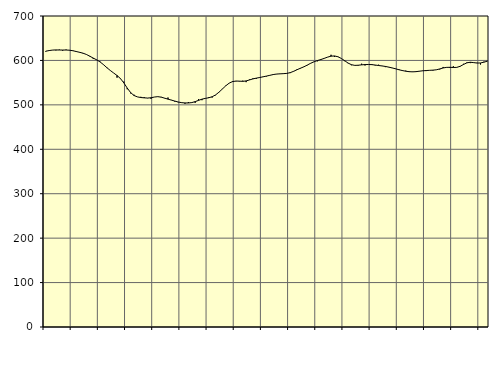
| Category | Piggar | Series 1 |
|---|---|---|
| nan | 619.7 | 620.73 |
| 87.0 | 622 | 622.19 |
| 87.0 | 623.1 | 623.29 |
| 87.0 | 622.6 | 623.64 |
| nan | 624.4 | 623.42 |
| 88.0 | 621.9 | 623.4 |
| 88.0 | 624.4 | 623.42 |
| 88.0 | 623.5 | 622.99 |
| nan | 621.2 | 621.82 |
| 89.0 | 621.1 | 620.06 |
| 89.0 | 618.9 | 618.25 |
| 89.0 | 615.7 | 616.25 |
| nan | 613.7 | 613.35 |
| 90.0 | 610.1 | 609.4 |
| 90.0 | 603.4 | 605.26 |
| 90.0 | 601.9 | 601.32 |
| nan | 597.5 | 596.67 |
| 91.0 | 590.2 | 590.57 |
| 91.0 | 582.8 | 583.75 |
| 91.0 | 577.6 | 577.49 |
| nan | 571.8 | 571.72 |
| 92.0 | 561.2 | 566.08 |
| 92.0 | 558.5 | 559.22 |
| 92.0 | 552.3 | 549.41 |
| nan | 535.1 | 537.87 |
| 93.0 | 525.8 | 527.65 |
| 93.0 | 522.8 | 521.03 |
| 93.0 | 517.8 | 517.9 |
| nan | 518.1 | 516.51 |
| 94.0 | 517.5 | 515.77 |
| 94.0 | 515 | 515.35 |
| 94.0 | 513.6 | 515.94 |
| nan | 517.7 | 517.61 |
| 95.0 | 518.2 | 518.44 |
| 95.0 | 517.9 | 517.31 |
| 95.0 | 514.7 | 515.1 |
| nan | 516.5 | 512.84 |
| 96.0 | 511.1 | 510.7 |
| 96.0 | 507.3 | 508.51 |
| 96.0 | 505.9 | 506.4 |
| nan | 505.5 | 504.96 |
| 97.0 | 502.5 | 504.31 |
| 97.0 | 506.3 | 504.22 |
| 97.0 | 505.6 | 505.11 |
| nan | 504.5 | 507.26 |
| 98.0 | 512.9 | 510.11 |
| 98.0 | 510.5 | 512.82 |
| 98.0 | 513.9 | 514.57 |
| nan | 517.4 | 515.97 |
| 99.0 | 516.4 | 518.27 |
| 99.0 | 521.7 | 522.31 |
| 99.0 | 528.7 | 528.45 |
| nan | 536.1 | 535.62 |
| 0.0 | 543.4 | 542.8 |
| 0.0 | 549 | 548.84 |
| 0.0 | 553.5 | 552.34 |
| nan | 553 | 553.6 |
| 1.0 | 552.7 | 553.36 |
| 1.0 | 554.5 | 552.91 |
| 1.0 | 551.1 | 553.88 |
| nan | 557.1 | 556.12 |
| 2.0 | 559.7 | 558.4 |
| 2.0 | 558.5 | 560.16 |
| 2.0 | 562.3 | 561.57 |
| nan | 563.5 | 563.15 |
| 3.0 | 564 | 564.79 |
| 3.0 | 566.4 | 566.49 |
| 3.0 | 569.2 | 568.23 |
| nan | 569.1 | 569.35 |
| 4.0 | 569.6 | 569.81 |
| 4.0 | 569.7 | 570.25 |
| 4.0 | 571.2 | 570.88 |
| nan | 571.5 | 572.53 |
| 5.0 | 576.1 | 575.57 |
| 5.0 | 580.2 | 579.14 |
| 5.0 | 581.8 | 582.49 |
| nan | 585.9 | 585.62 |
| 6.0 | 589 | 589.52 |
| 6.0 | 594 | 593.61 |
| 6.0 | 597.3 | 597.02 |
| nan | 598 | 599.76 |
| 7.0 | 603.1 | 602 |
| 7.0 | 605 | 604.65 |
| 7.0 | 607.3 | 607.48 |
| nan | 612.7 | 609.6 |
| 8.0 | 607.9 | 610.1 |
| 8.0 | 609 | 608.33 |
| 8.0 | 604.5 | 604.57 |
| nan | 598.3 | 599.48 |
| 9.0 | 593.8 | 594.14 |
| 9.0 | 589.2 | 590.41 |
| 9.0 | 589.1 | 588.85 |
| nan | 588.3 | 589.2 |
| 10.0 | 592.6 | 590.04 |
| 10.0 | 588.6 | 590.67 |
| 10.0 | 590.5 | 590.87 |
| nan | 591.9 | 590.52 |
| 11.0 | 588.7 | 589.64 |
| 11.0 | 590.4 | 588.52 |
| 11.0 | 587.4 | 587.61 |
| nan | 584.9 | 586.48 |
| 12.0 | 585.3 | 584.88 |
| 12.0 | 582.8 | 583.13 |
| 12.0 | 581.7 | 581.13 |
| nan | 580 | 579 |
| 13.0 | 576.2 | 577.2 |
| 13.0 | 577 | 575.68 |
| 13.0 | 575.6 | 574.67 |
| nan | 574.8 | 574.31 |
| 14.0 | 574.2 | 574.72 |
| 14.0 | 575.3 | 575.78 |
| 14.0 | 576.2 | 576.63 |
| nan | 576 | 577.23 |
| 15.0 | 578 | 577.72 |
| 15.0 | 577.2 | 578.13 |
| 15.0 | 578.7 | 578.93 |
| nan | 579.7 | 580.85 |
| 16.0 | 585.3 | 583.06 |
| 16.0 | 584.8 | 584.36 |
| 16.0 | 582.9 | 584.51 |
| nan | 586.9 | 584.02 |
| 17.0 | 583.9 | 584.35 |
| 17.0 | 586.2 | 586.74 |
| 17.0 | 592.4 | 590.91 |
| nan | 595.6 | 594.62 |
| 18.0 | 594 | 595.87 |
| 18.0 | 594.7 | 595.09 |
| 18.0 | 594.7 | 594.09 |
| nan | 590.8 | 594.31 |
| 19.0 | 597.2 | 596.07 |
| 19.0 | 599.4 | 598.19 |